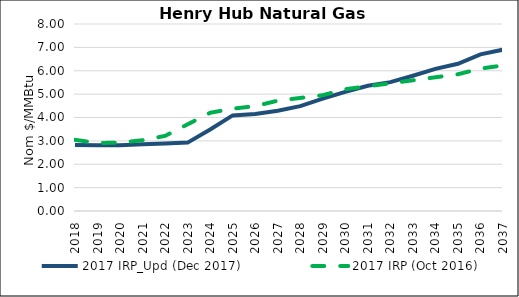
| Category | 2017 IRP_Upd (Dec 2017) | 2017 IRP (Oct 2016) |
|---|---|---|
| 2018.0 | 2.827 | 3.044 |
| 2019.0 | 2.812 | 2.908 |
| 2020.0 | 2.816 | 2.925 |
| 2021.0 | 2.851 | 3.029 |
| 2022.0 | 2.886 | 3.213 |
| 2023.0 | 2.926 | 3.708 |
| 2024.0 | 3.487 | 4.202 |
| 2025.0 | 4.089 | 4.377 |
| 2026.0 | 4.152 | 4.487 |
| 2027.0 | 4.291 | 4.72 |
| 2028.0 | 4.484 | 4.837 |
| 2029.0 | 4.804 | 4.954 |
| 2030.0 | 5.099 | 5.21 |
| 2031.0 | 5.355 | 5.338 |
| 2032.0 | 5.513 | 5.463 |
| 2033.0 | 5.785 | 5.593 |
| 2034.0 | 6.078 | 5.722 |
| 2035.0 | 6.301 | 5.85 |
| 2036.0 | 6.7 | 6.092 |
| 2037.0 | 6.901 | 6.227 |